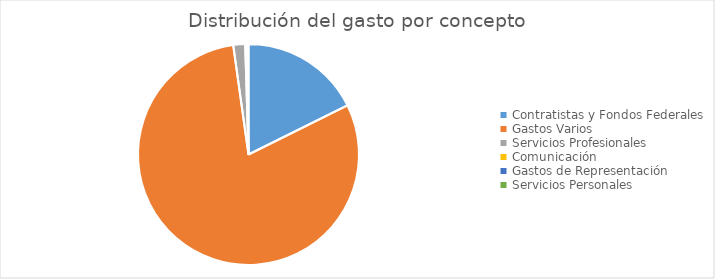
| Category | Series 0 |
|---|---|
| Contratistas y Fondos Federales | 78726388.96 |
| Gastos Varios | 357362126.31 |
| Servicios Profesionales | 7732547.61 |
| Comunicación | 875999.56 |
| Gastos de Representación | 323748.8 |
| Servicios Personales | 932922.99 |